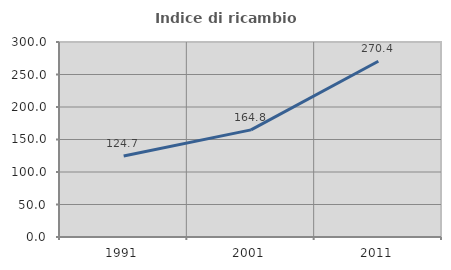
| Category | Indice di ricambio occupazionale  |
|---|---|
| 1991.0 | 124.731 |
| 2001.0 | 164.839 |
| 2011.0 | 270.37 |